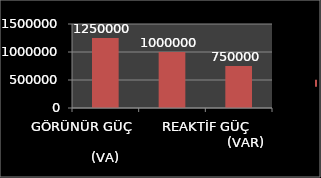
| Category | Series 0 |
|---|---|
| GÖRÜNÜR GÜÇ                                                (VA) | 1250000 |
| AKTİF GÜÇ                         (W) | 1000000 |
| REAKTİF GÜÇ                    (VAR) | 750000 |